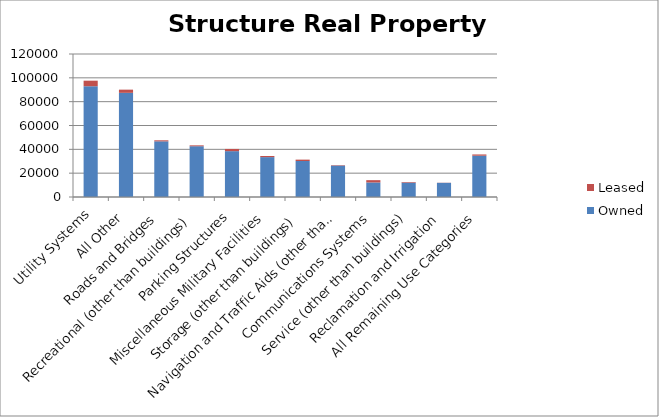
| Category | Owned | Leased |
|---|---|---|
| Utility Systems | 92965 | 4645 |
| All Other | 87424 | 2662 |
| Roads and Bridges | 46703 | 867 |
| Recreational (other than buildings) | 42597 | 746 |
| Parking Structures | 38478 | 1837 |
| Miscellaneous Military Facilities | 33461 | 965 |
| Storage (other than buildings) | 30194 | 1167 |
| Navigation and Traffic Aids (other than buildings) | 26390 | 371 |
| Communications Systems | 12202 | 1930 |
| Service (other than buildings) | 12047 | 515 |
| Reclamation and Irrigation | 11873 | 125 |
| All Remaining Use Categories | 34655 | 1047 |